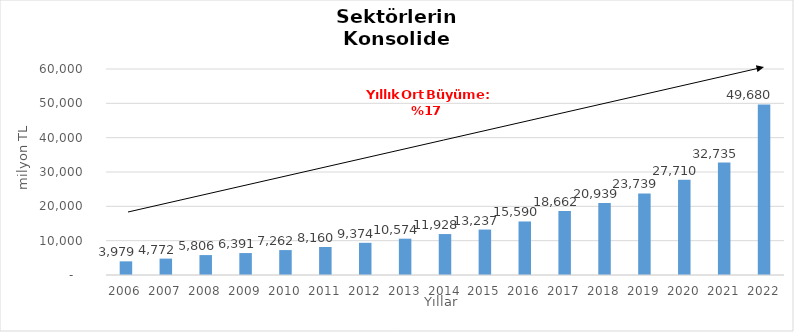
| Category | Toplam |
|---|---|
| 2006.0 | 3978.535 |
| 2007.0 | 4771.635 |
| 2008.0 | 5805.717 |
| 2009.0 | 6391.175 |
| 2010.0 | 7262.062 |
| 2011.0 | 8159.605 |
| 2012.0 | 9374.412 |
| 2013.0 | 10573.674 |
| 2014.0 | 11928 |
| 2015.0 | 13237 |
| 2016.0 | 15590 |
| 2017.0 | 18662 |
| 2018.0 | 20939 |
| 2019.0 | 23739 |
| 2020.0 | 27710 |
| 2021.0 | 32735 |
| 2022.0 | 49680 |